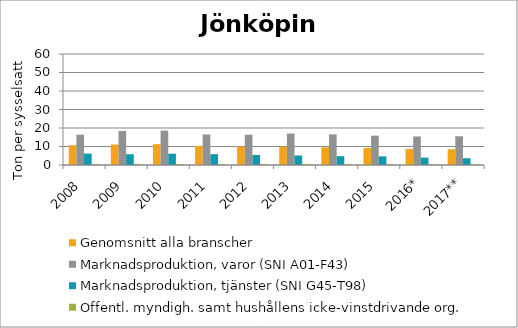
| Category | Genomsnitt alla branscher | Marknadsproduktion, varor (SNI A01-F43) | Marknadsproduktion, tjänster (SNI G45-T98) | Offentl. myndigh. samt hushållens icke-vinstdrivande org. |
|---|---|---|---|---|
| 2008 | 10.673 | 16.4 | 6.172 | 0.512 |
| 2009 | 11.086 | 18.366 | 5.813 | 0.529 |
| 2010 | 11.269 | 18.574 | 6.115 | 0.527 |
| 2011 | 10.332 | 16.49 | 5.867 | 0.493 |
| 2012 | 9.989 | 16.345 | 5.433 | 0.506 |
| 2013 | 9.963 | 17.027 | 5.152 | 0.464 |
| 2014 | 9.549 | 16.571 | 4.762 | 0.415 |
| 2015 | 9.23 | 15.874 | 4.682 | 0.386 |
| 2016* | 8.632 | 15.416 | 3.989 | 0.371 |
| 2017** | 8.518 | 15.534 | 3.66 | 0.346 |